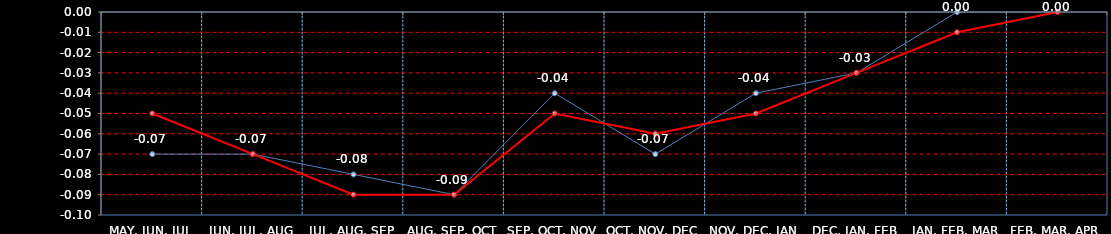
| Category | Last | Settlement |
|---|---|---|
| MAY, JUN, JUL | -0.07 | -0.05 |
| JUN, JUL, AUG | -0.07 | -0.07 |
| JUL, AUG, SEP | -0.08 | -0.09 |
| AUG, SEP, OCT | -0.09 | -0.09 |
| SEP, OCT, NOV | -0.04 | -0.05 |
| OCT, NOV, DEC | -0.07 | -0.06 |
| NOV, DEC, JAN | -0.04 | -0.05 |
| DEC, JAN, FEB | -0.03 | -0.03 |
| JAN, FEB, MAR | 0 | -0.01 |
| FEB, MAR, APR | 0 | 0 |